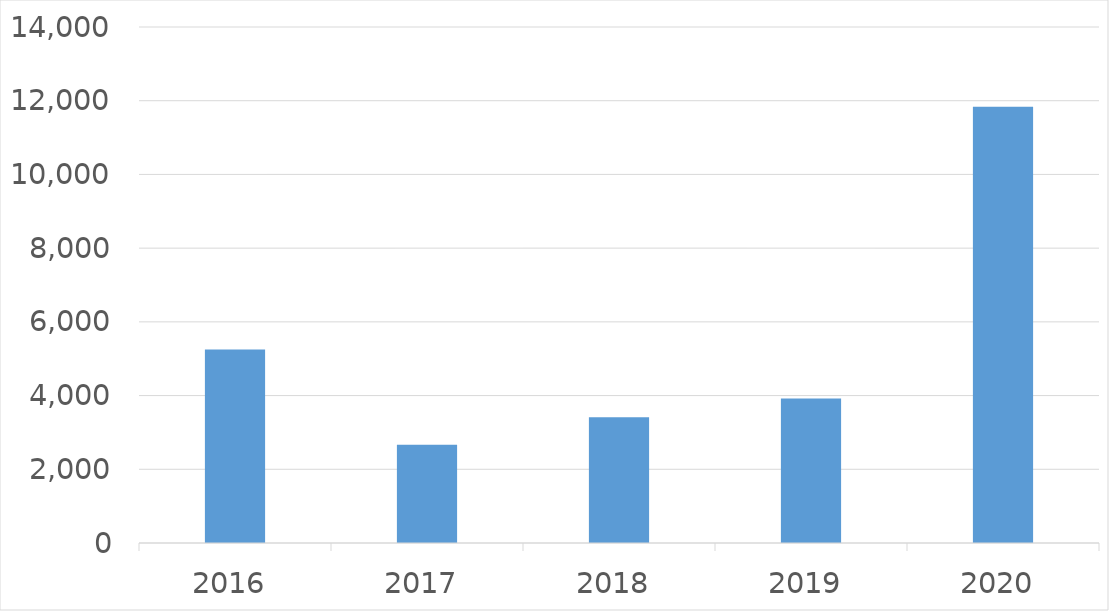
| Category | Series 0 |
|---|---|
| 2016 | 5249 |
| 2017 | 2664 |
| 2018 | 3410 |
| 2019 | 3923 |
| 2020 | 11835 |